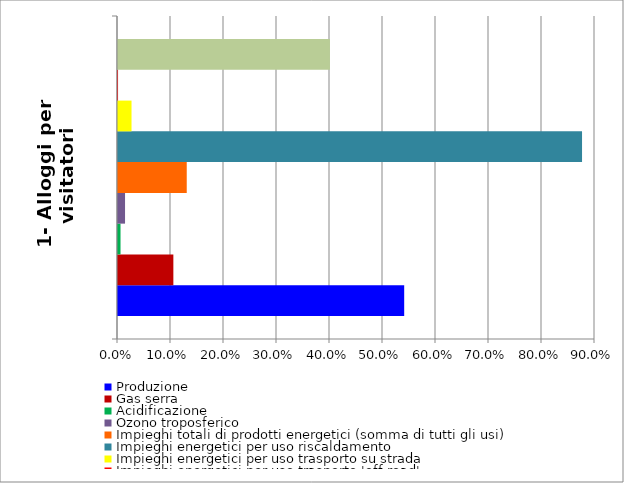
| Category | Produzione | Gas serra | Acidificazione | Ozono troposferico | Impieghi totali di prodotti energetici (somma di tutti gli usi) | Impieghi energetici per uso riscaldamento | Impieghi energetici per uso trasporto su strada | Impieghi energetici per uso trasporto 'off road' | Impieghi di elettricità |
|---|---|---|---|---|---|---|---|---|---|
| 1- Alloggi per visitatori | 0.54 | 0.104 | 0.005 | 0.013 | 0.13 | 0.876 | 0.026 | 0 | 0.4 |